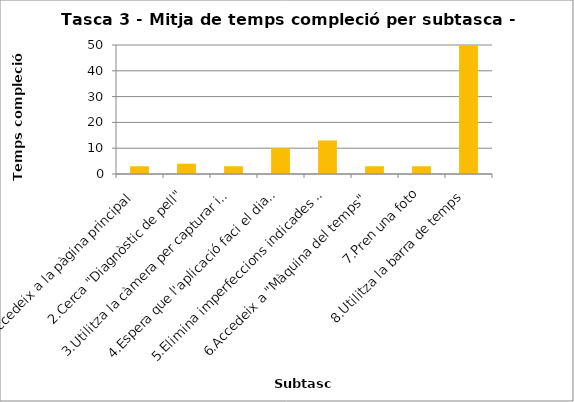
| Category | Series 0 |
|---|---|
| 1.Accedeix a la pàgina principal | 3 |
| 2.Cerca "Diagnòstic de pell" | 4 |
| 3.Utilitza la càmera per capturar imatge del rostre | 3 |
| 4.Espera que l'aplicació faci el diagnòstic | 10 |
| 5.Elimina imperfeccions indicades pel sistema | 13 |
| 6.Accedeix a "Màquina del temps" | 3 |
| 7.Pren una foto | 3 |
| 8.Utilitza la barra de temps | 51 |